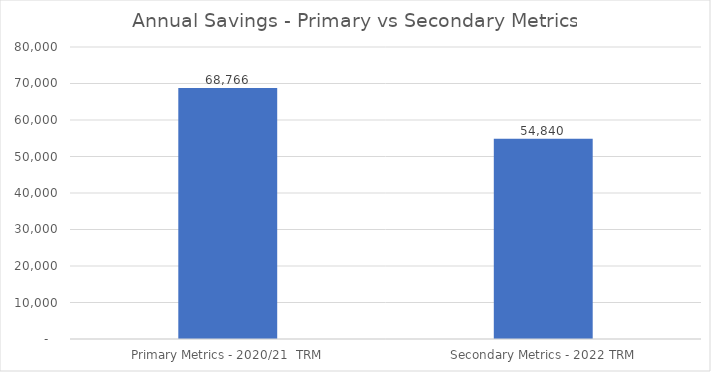
| Category | Series 0 |
|---|---|
| Primary Metrics - 2020/21  TRM | 68765.68 |
| Secondary Metrics - 2022 TRM | 54839.803 |